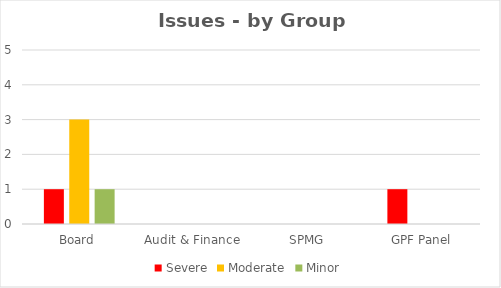
| Category | Severe | Moderate | Minor |
|---|---|---|---|
| Board | 1 | 3 | 1 |
| Audit & Finance | 0 | 0 | 0 |
| SPMG | 0 | 0 | 0 |
| GPF Panel | 1 | 0 | 0 |